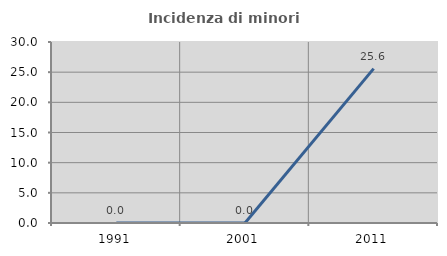
| Category | Incidenza di minori stranieri |
|---|---|
| 1991.0 | 0 |
| 2001.0 | 0 |
| 2011.0 | 25.581 |